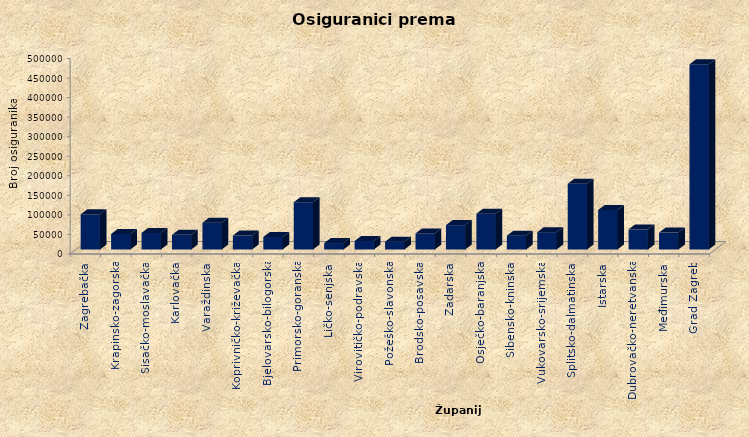
| Category | Series 0 |
|---|---|
| Zagrebačka | 89955 |
| Krapinsko-zagorska | 39699 |
| Sisačko-moslavačka | 42352 |
| Karlovačka | 37463 |
| Varaždinska | 68555 |
| Koprivničko-križevačka | 35751 |
| Bjelovarsko-bilogorska | 31958 |
| Primorsko-goranska | 120947 |
| Ličko-senjska | 16438 |
| Virovitičko-podravska | 21860 |
| Požeško-slavonska | 19984 |
| Brodsko-posavska | 41099 |
| Zadarska | 62349 |
| Osječko-baranjska | 91500 |
| Šibensko-kninska | 35276 |
| Vukovarsko-srijemska | 44286 |
| Splitsko-dalmatinska | 168063 |
| Istarska | 101133 |
| Dubrovačko-neretvanska | 51448 |
| Međimurska | 43189 |
| Grad Zagreb | 473666 |